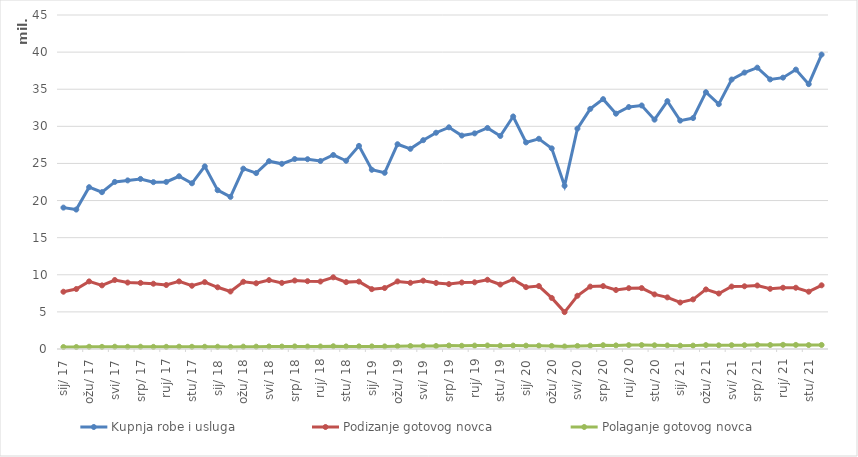
| Category | Kupnja robe i usluga | Podizanje gotovog novca | Polaganje gotovog novca |
|---|---|---|---|
| 2017-01-01 | 19049740 | 7716439 | 265475 |
| 2017-02-01 | 18785910 | 8081647 | 265311 |
| 2017-03-01 | 21801248 | 9107151 | 302879 |
| 2017-04-01 | 21129812 | 8571202 | 288079 |
| 2017-05-01 | 22511452 | 9294160 | 306151 |
| 2017-06-01 | 22715590 | 8951156 | 296174 |
| 2017-07-01 | 22914007 | 8905597 | 308473 |
| 2017-08-01 | 22481726 | 8794295 | 287793 |
| 2017-09-01 | 22509349 | 8620457 | 292598 |
| 2017-10-01 | 23273782 | 9107770 | 314282 |
| 2017-11-01 | 22326676 | 8521273 | 297593 |
| 2017-12-01 | 24603928 | 9011798 | 298450 |
| 2018-01-01 | 21396290 | 8314259 | 305732 |
| 2018-02-01 | 20491901 | 7749190 | 278411 |
| 2018-03-01 | 24296065 | 9056018 | 316824 |
| 2018-04-01 | 23700086 | 8856107 | 314520 |
| 2018-05-01 | 25302064 | 9282489 | 334814 |
| 2018-06-01 | 24948705 | 8910680 | 327731 |
| 2018-07-01 | 25594455 | 9224908 | 345087 |
| 2018-08-01 | 25571707 | 9136840 | 326566 |
| 2018-09-01 | 25329990 | 9093823 | 337978 |
| 2018-10-01 | 26139693 | 9657377 | 370965 |
| 2018-11-01 | 25358722 | 9011008 | 349382 |
| 2018-12-01 | 27366263 | 9079602 | 351122 |
| 2019-01-01 | 24146356 | 8064158 | 350414 |
| 2019-02-01 | 23738333 | 8215912 | 346721 |
| 2019-03-01 | 27590008 | 9105578 | 381640 |
| 2019-04-01 | 26971169 | 8915705 | 404555 |
| 2019-05-01 | 28133460 | 9207026 | 418371 |
| 2019-06-01 | 29138551 | 8897073 | 406867 |
| 2019-07-01 | 29867201 | 8744389 | 467229 |
| 2019-08-01 | 28755040 | 8960968 | 432139 |
| 2019-09-01 | 29050955 | 8985078 | 458365 |
| 2019-10-01 | 29778371 | 9328480 | 476692 |
| 2019-11-01 | 28702400 | 8686035 | 449473 |
| 2019-12-01 | 31322325 | 9376124 | 460961 |
| 2020-01-01 | 27832713 | 8332368 | 450878 |
| 2020-02-01 | 28324162 | 8482987 | 447770 |
| 2020-03-01 | 27028800 | 6881927 | 410766 |
| 2020-04-01 | 21988750 | 4973853 | 335862 |
| 2020-05-01 | 29693146 | 7174272 | 409903 |
| 2020-06-01 | 32350132 | 8407235 | 452594 |
| 2020-07-01 | 33663077 | 8474647 | 513578 |
| 2020-08-01 | 31706352 | 7950573 | 486042 |
| 2020-09-01 | 32599708 | 8196347 | 523384 |
| 2020-10-01 | 32809206 | 8206682 | 531971 |
| 2020-11-01 | 30900514 | 7356371 | 499213 |
| 2020-12-01 | 33392978 | 6952764 | 482220 |
| 2021-01-01 | 30772056 | 6263389 | 447622 |
| 2021-02-01 | 31115190 | 6682115 | 454755 |
| 2021-03-01 | 34601367 | 8025336 | 524723 |
| 2021-04-01 | 32984704 | 7476350 | 497751 |
| 2021-05-01 | 36306414 | 8414533 | 513669 |
| 2021-06-01 | 37241317 | 8451137 | 510433 |
| 2021-07-01 | 37904786 | 8557835 | 565085 |
| 2021-08-01 | 36321222 | 8108194 | 542230 |
| 2021-09-01 | 36559420 | 8254372 | 564059 |
| 2021-10-01 | 37644541 | 8253416 | 551648 |
| 2021-11-01 | 35687517 | 7721530 | 528460 |
| 2021-12-01 | 39670305 | 8580700 | 544950 |